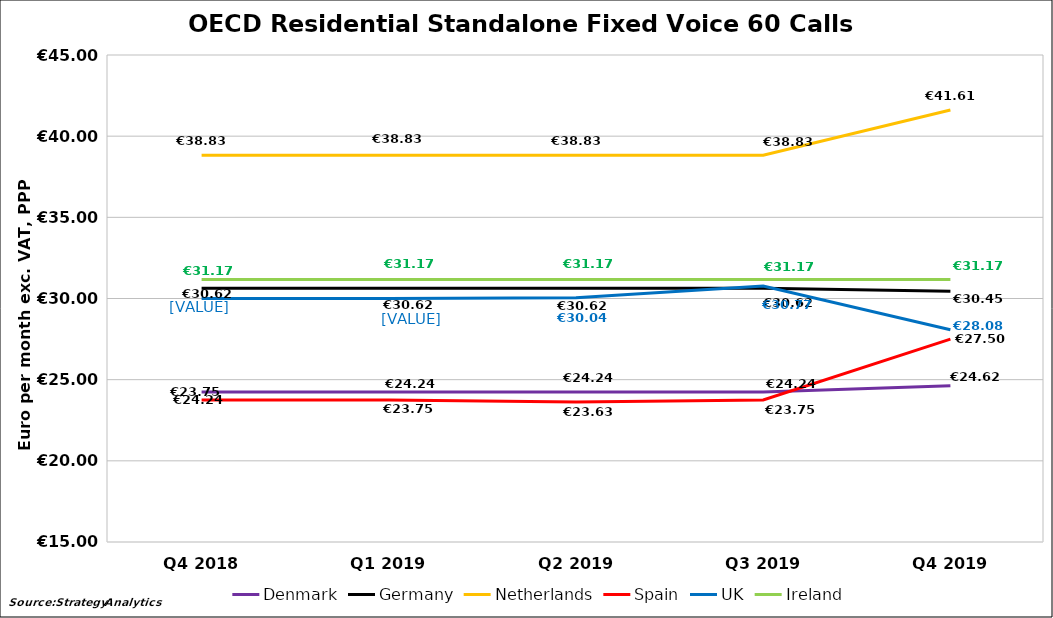
| Category | Denmark | Germany | Netherlands | Spain | UK | Ireland |
|---|---|---|---|---|---|---|
| Q4 2018 | 24.243 | 30.625 | 38.826 | 23.747 | 29.994 | 31.168 |
| Q1 2019 | 24.243 | 30.625 | 38.826 | 23.747 | 29.994 | 31.168 |
| Q2 2019 | 24.243 | 30.625 | 38.826 | 23.625 | 30.044 | 31.168 |
| Q3 2019 | 24.243 | 30.625 | 38.826 | 23.747 | 30.767 | 31.168 |
| Q4 2019 | 24.62 | 30.45 | 41.61 | 27.5 | 28.08 | 31.17 |